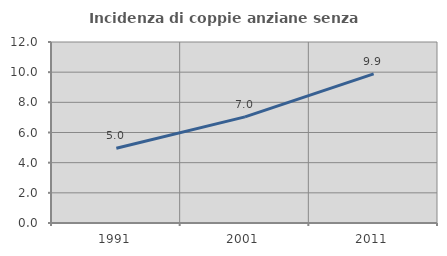
| Category | Incidenza di coppie anziane senza figli  |
|---|---|
| 1991.0 | 4.957 |
| 2001.0 | 7.037 |
| 2011.0 | 9.884 |